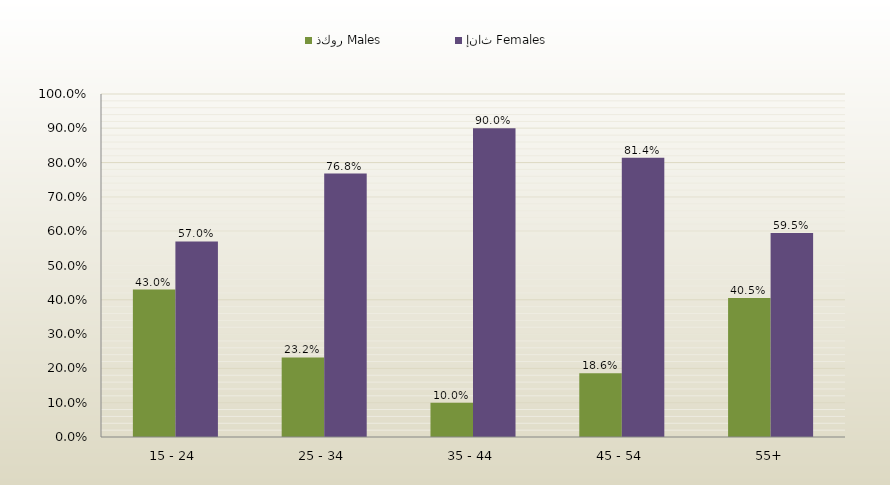
| Category | ذكور Males | إناث Females |
|---|---|---|
| 15 - 24 | 0.43 | 0.57 |
| 25 - 34 | 0.232 | 0.768 |
| 35 - 44 | 0.1 | 0.9 |
| 45 - 54 | 0.186 | 0.814 |
| 55+ | 0.405 | 0.595 |